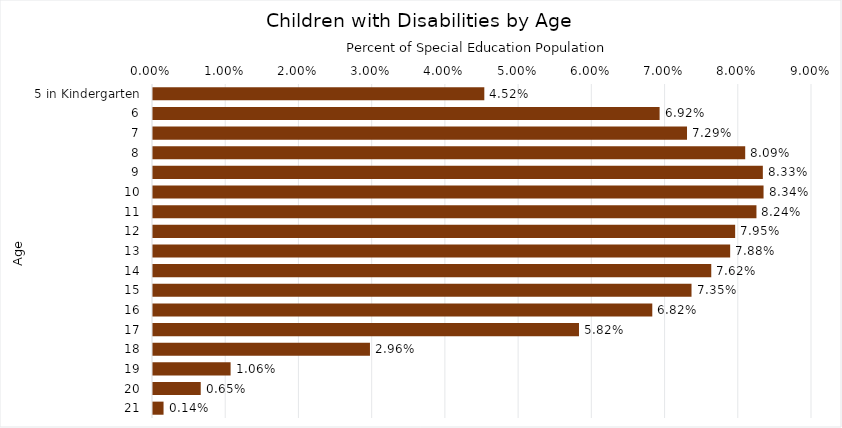
| Category | Percentage |
|---|---|
| 5 in Kindergarten | 0.045 |
| 6 | 0.069 |
| 7 | 0.073 |
| 8 | 0.081 |
| 9 | 0.083 |
| 10 | 0.083 |
| 11 | 0.082 |
| 12 | 0.08 |
| 13 | 0.079 |
| 14 | 0.076 |
| 15 | 0.074 |
| 16 | 0.068 |
| 17 | 0.058 |
| 18 | 0.03 |
| 19 | 0.011 |
| 20 | 0.007 |
| 21 | 0.001 |